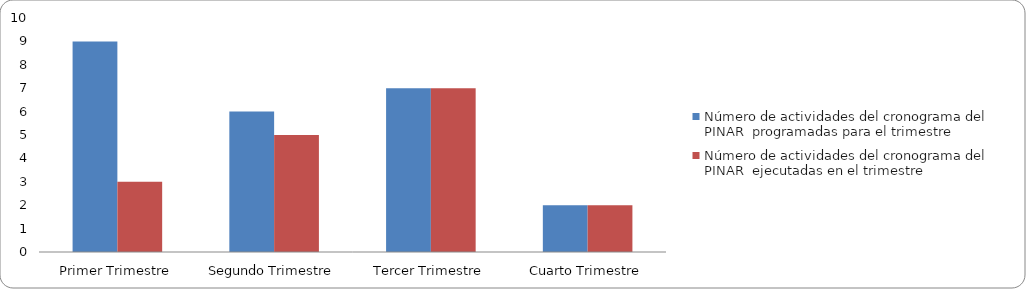
| Category | Número de actividades del cronograma del PINAR  programadas para el trimestre | Número de actividades del cronograma del PINAR  ejecutadas en el trimestre  |
|---|---|---|
| Primer Trimestre | 9 | 3 |
| Segundo Trimestre | 6 | 5 |
| Tercer Trimestre | 7 | 7 |
| Cuarto Trimestre | 2 | 2 |